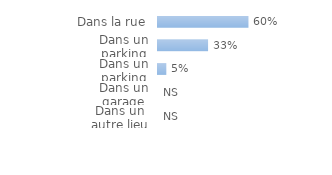
| Category | Ensemble des ménages victimes |
|---|---|
| Dans un autre lieu | 0 |
| Dans un garage | 0 |
| Dans un parking fermé | 0.055 |
| Dans un parking ouvert | 0.329 |
| Dans la rue | 0.595 |